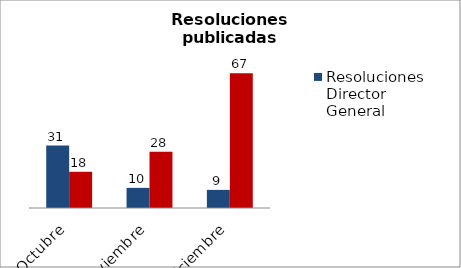
| Category | Resoluciones Director            General | Resoluciones                   Dirección                      Signos Dist. |
|---|---|---|
| Octubre | 31 | 18 |
| Noviembre | 10 | 28 |
| Diciembre | 9 | 67 |